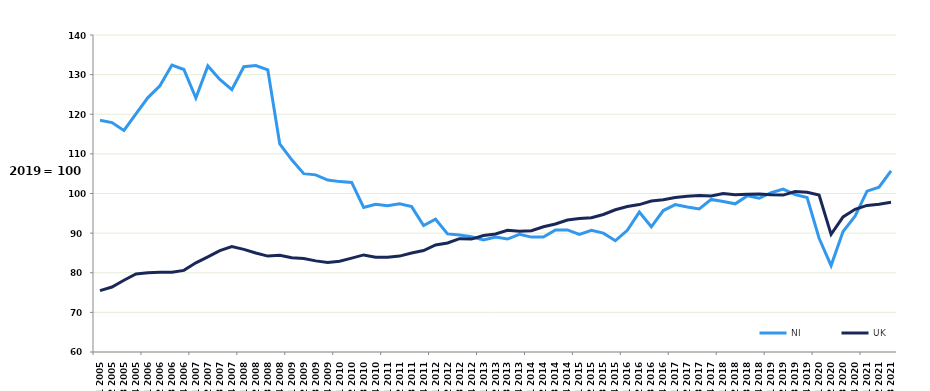
| Category | NI | UK |
|---|---|---|
| Q1 2005 | 118.5 | 75.5 |
| Q2 2005 | 117.9 | 76.4 |
| Q3 2005 | 115.9 | 78.1 |
| Q4 2005 | 120.1 | 79.7 |
| Q1 2006 | 124.2 | 80 |
| Q2 2006 | 127.2 | 80.1 |
| Q3 2006 | 132.4 | 80.1 |
| Q4 2006 | 131.3 | 80.6 |
| Q1 2007 | 124.1 | 82.5 |
| Q2 2007 | 132.2 | 84 |
| Q3 2007 | 128.8 | 85.6 |
| Q4 2007 | 126.2 | 86.6 |
| Q1 2008 | 132 | 85.9 |
| Q2 2008 | 132.3 | 85 |
| Q3 2008 | 131.2 | 84.2 |
| Q4 2008 | 112.5 | 84.4 |
| Q1 2009 | 108.5 | 83.8 |
| Q2 2009 | 105 | 83.6 |
| Q3 2009 | 104.7 | 83 |
| Q4 2009 | 103.4 | 82.6 |
| Q1 2010 | 103 | 82.9 |
| Q2 2010 | 102.8 | 83.7 |
| Q3 2010 | 96.5 | 84.5 |
| Q4 2010 | 97.3 | 83.9 |
| Q1 2011 | 96.9 | 83.9 |
| Q2 2011 | 97.4 | 84.2 |
| Q3 2011 | 96.7 | 85 |
| Q4 2011 | 91.9 | 85.6 |
| Q1 2012 | 93.5 | 87 |
| Q2 2012 | 89.8 | 87.5 |
| Q3 2012 | 89.5 | 88.6 |
| Q4 2012 | 89.1 | 88.5 |
| Q1 2013 | 88.3 | 89.4 |
| Q2 2013 | 89 | 89.8 |
| Q3 2013 | 88.5 | 90.7 |
| Q4 2013 | 89.7 | 90.5 |
| Q1 2014 | 89 | 90.6 |
| Q2 2014 | 89 | 91.6 |
| Q3 2014 | 90.8 | 92.3 |
| Q4 2014 | 90.8 | 93.3 |
| Q1 2015 | 89.7 | 93.7 |
| Q2 2015 | 90.7 | 93.9 |
| Q3 2015 | 90 | 94.7 |
| Q4 2015 | 88.1 | 95.9 |
| Q1 2016 | 90.7 | 96.7 |
| Q2 2016 | 95.3 | 97.2 |
| Q3 2016 | 91.6 | 98.1 |
| Q4 2016 | 95.7 | 98.4 |
| Q1 2017 | 97.2 | 99 |
| Q2 2017 | 96.6 | 99.3 |
| Q3 2017 | 96.1 | 99.5 |
| Q4 2017 | 98.5 | 99.4 |
| Q1 2018 | 98 | 100 |
| Q2 2018 | 97.4 | 99.7 |
| Q3 2018 | 99.4 | 99.8 |
| Q4 2018 | 98.8 | 99.9 |
| Q1 2019 | 100.2 | 99.7 |
| Q2 2019 | 101.1 | 99.6 |
| Q3 2019 | 99.7 | 100.5 |
| Q4 2019 | 99 | 100.3 |
| Q1 2020 | 88.7 | 99.6 |
| Q2 2020 | 81.8 | 89.7 |
| Q3 2020 | 90.4 | 94.1 |
| Q4 2020 | 94.3 | 96 |
| Q1 2021 | 100.6 | 97 |
| Q2 2021 | 101.6 | 97.3 |
| Q3 2021 | 105.7 | 97.8 |